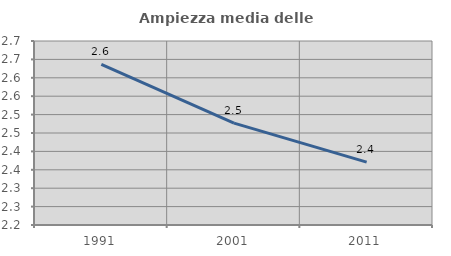
| Category | Ampiezza media delle famiglie |
|---|---|
| 1991.0 | 2.637 |
| 2001.0 | 2.477 |
| 2011.0 | 2.371 |